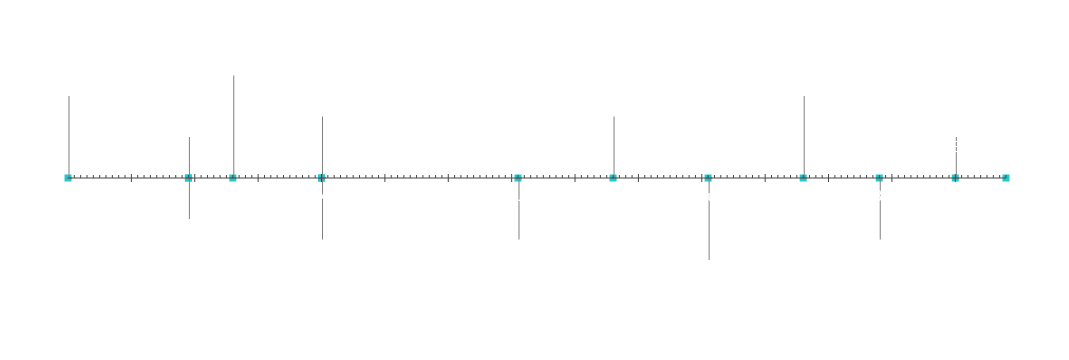
| Category | Pozice |
|---|---|
| Začátek projektu | 20 |
| Milník 1 | 10 |
| Milník 2 | -10 |
| Milník 3 | 25 |
| Milník 4 | -15 |
| Milník 5 | 15 |
| Milník 6 | -15 |
| Milník 7 | 15 |
| Milník 8 | -20 |
| Milník 9 | 20 |
| Milník 10 | -15 |
| Milník 11 | 10 |
| Konec projektu | 5 |